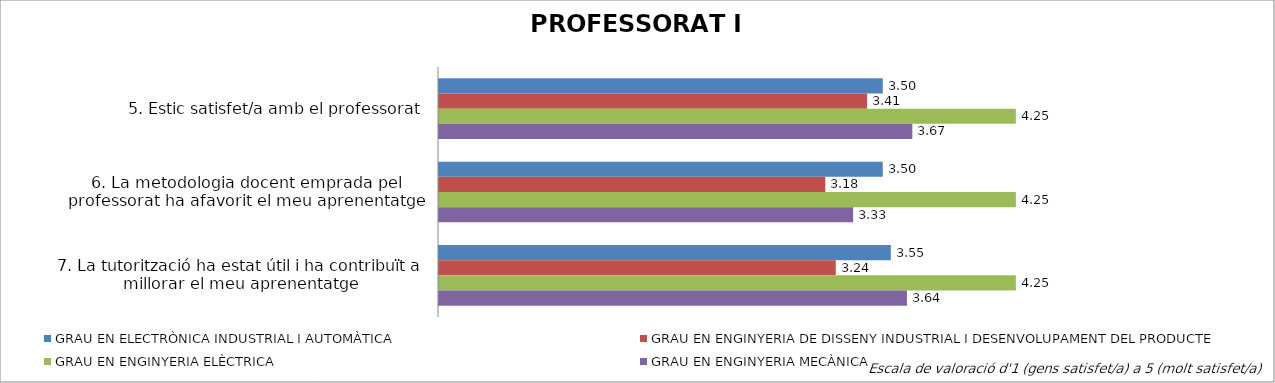
| Category | GRAU EN ELECTRÒNICA INDUSTRIAL I AUTOMÀTICA | GRAU EN ENGINYERIA DE DISSENY INDUSTRIAL I DESENVOLUPAMENT DEL PRODUCTE | GRAU EN ENGINYERIA ELÈCTRICA | GRAU EN ENGINYERIA MECÀNICA |
|---|---|---|---|---|
| 5. Estic satisfet/a amb el professorat | 3.5 | 3.412 | 4.25 | 3.667 |
| 6. La metodologia docent emprada pel professorat ha afavorit el meu aprenentatge | 3.5 | 3.176 | 4.25 | 3.333 |
| 7. La tutorització ha estat útil i ha contribuït a millorar el meu aprenentatge | 3.545 | 3.235 | 4.25 | 3.636 |